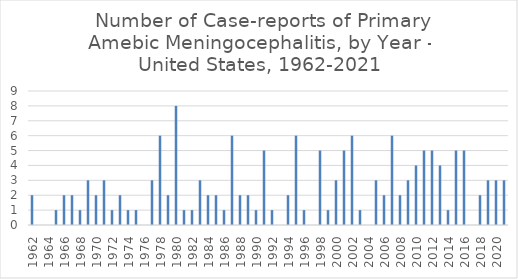
| Category | No. of Case-reports |
|---|---|
| 1962.0 | 2 |
| 1963.0 | 0 |
| 1964.0 | 0 |
| 1965.0 | 1 |
| 1966.0 | 2 |
| 1967.0 | 2 |
| 1968.0 | 1 |
| 1969.0 | 3 |
| 1970.0 | 2 |
| 1971.0 | 3 |
| 1972.0 | 1 |
| 1973.0 | 2 |
| 1974.0 | 1 |
| 1975.0 | 1 |
| 1976.0 | 0 |
| 1977.0 | 3 |
| 1978.0 | 6 |
| 1979.0 | 2 |
| 1980.0 | 8 |
| 1981.0 | 1 |
| 1982.0 | 1 |
| 1983.0 | 3 |
| 1984.0 | 2 |
| 1985.0 | 2 |
| 1986.0 | 1 |
| 1987.0 | 6 |
| 1988.0 | 2 |
| 1989.0 | 2 |
| 1990.0 | 1 |
| 1991.0 | 5 |
| 1992.0 | 1 |
| 1993.0 | 0 |
| 1994.0 | 2 |
| 1995.0 | 6 |
| 1996.0 | 1 |
| 1997.0 | 0 |
| 1998.0 | 5 |
| 1999.0 | 1 |
| 2000.0 | 3 |
| 2001.0 | 5 |
| 2002.0 | 6 |
| 2003.0 | 1 |
| 2004.0 | 0 |
| 2005.0 | 3 |
| 2006.0 | 2 |
| 2007.0 | 6 |
| 2008.0 | 2 |
| 2009.0 | 3 |
| 2010.0 | 4 |
| 2011.0 | 5 |
| 2012.0 | 5 |
| 2013.0 | 4 |
| 2014.0 | 1 |
| 2015.0 | 5 |
| 2016.0 | 5 |
| 2017.0 | 0 |
| 2018.0 | 2 |
| 2019.0 | 3 |
| 2020.0 | 3 |
| 2021.0 | 3 |